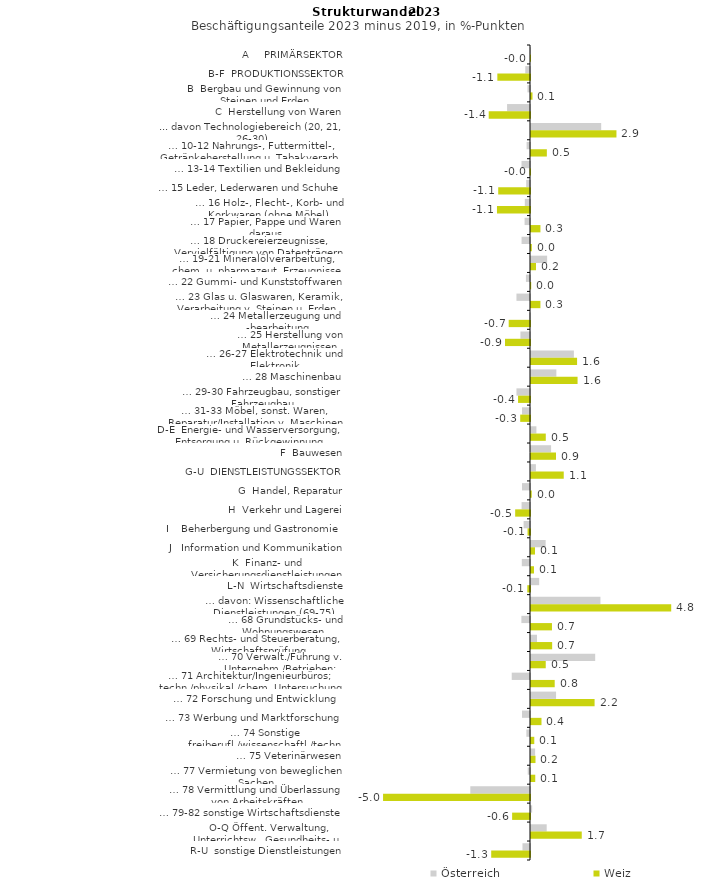
| Category | Österreich | Weiz |
|---|---|---|
| A     PRIMÄRSEKTOR | -0.007 | -0.003 |
| B-F  PRODUKTIONSSEKTOR | -0.161 | -1.113 |
| B  Bergbau und Gewinnung von Steinen und Erden | -0.086 | 0.051 |
| C  Herstellung von Waren | -0.782 | -1.407 |
| ... davon Technologiebereich (20, 21, 26-30) | 2.393 | 2.913 |
| … 10-12 Nahrungs-, Futtermittel-, Getränkeherstellung u. Tabakverarb. | -0.116 | 0.54 |
| … 13-14 Textilien und Bekleidung | -0.289 | -0.017 |
| … 15 Leder, Lederwaren und Schuhe | -0.13 | -1.084 |
| … 16 Holz-, Flecht-, Korb- und Korkwaren (ohne Möbel)  | -0.177 | -1.126 |
| … 17 Papier, Pappe und Waren daraus  | -0.185 | 0.322 |
| … 18 Druckereierzeugnisse, Vervielfältigung von Datenträgern | -0.288 | 0.028 |
| … 19-21 Mineralölverarbeitung, chem. u. pharmazeut. Erzeugnisse | 0.549 | 0.17 |
| … 22 Gummi- und Kunststoffwaren | -0.139 | 0.006 |
| … 23 Glas u. Glaswaren, Keramik, Verarbeitung v. Steinen u. Erden  | -0.462 | 0.321 |
| … 24 Metallerzeugung und -bearbeitung | -0.032 | -0.726 |
| … 25 Herstellung von Metallerzeugnissen  | -0.325 | -0.852 |
| … 26-27 Elektrotechnik und Elektronik | 1.462 | 1.571 |
| … 28 Maschinenbau | 0.864 | 1.588 |
| … 29-30 Fahrzeugbau, sonstiger Fahrzeugbau | -0.462 | -0.407 |
| … 31-33 Möbel, sonst. Waren, Reparatur/Installation v. Maschinen | -0.273 | -0.334 |
| D-E  Energie- und Wasserversorgung, Entsorgung u. Rückgewinnung | 0.184 | 0.504 |
| F  Bauwesen | 0.684 | 0.853 |
| G-U  DIENSTLEISTUNGSSEKTOR | 0.167 | 1.116 |
| G  Handel, Reparatur | -0.273 | 0.025 |
| H  Verkehr und Lagerei | -0.287 | -0.505 |
| I    Beherbergung und Gastronomie | -0.218 | -0.083 |
| J   Information und Kommunikation | 0.499 | 0.136 |
| K  Finanz- und Versicherungsdienstleistungen | -0.279 | 0.102 |
| L-N  Wirtschaftsdienste | 0.279 | -0.092 |
| … davon: Wissenschaftliche Dienstleistungen (69-75) | 2.367 | 4.78 |
| … 68 Grundstücks- und Wohnungswesen  | -0.294 | 0.715 |
| … 69 Rechts- und Steuerberatung, Wirtschaftsprüfung | 0.205 | 0.721 |
| … 70 Verwalt./Führung v. Unternehm./Betrieben; Unternehmensberat. | 2.188 | 0.502 |
| … 71 Architektur/Ingenieurbüros; techn./physikal./chem. Untersuchung | -0.622 | 0.808 |
| … 72 Forschung und Entwicklung  | 0.854 | 2.168 |
| … 73 Werbung und Marktforschung | -0.273 | 0.358 |
| … 74 Sonstige freiberufl./wissenschaftl./techn. Tätigkeiten | -0.124 | 0.112 |
| … 75 Veterinärwesen | 0.14 | 0.153 |
| … 77 Vermietung von beweglichen Sachen  | -0.077 | 0.145 |
| … 78 Vermittlung und Überlassung von Arbeitskräften | -2.035 | -5.01 |
| … 79-82 sonstige Wirtschaftsdienste | 0.039 | -0.609 |
| O-Q Öffent. Verwaltung, Unterrichtsw., Gesundheits- u. Sozialwesen | 0.535 | 1.73 |
| R-U  sonstige Dienstleistungen | -0.256 | -1.323 |